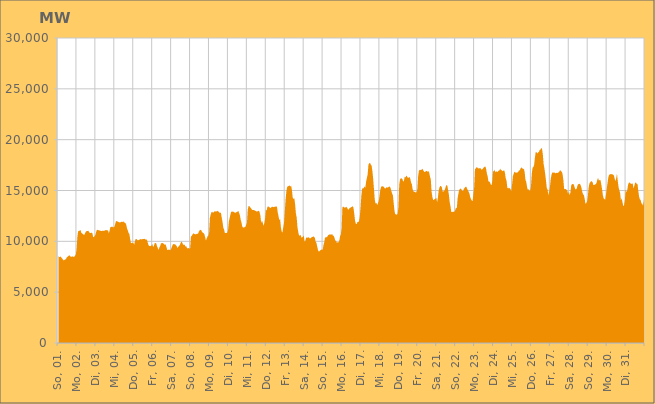
| Category | Series 0 |
|---|---|
|  So, 01.  | 8558.485 |
|  So, 01.  | 8463.427 |
|  So, 01.  | 8463.648 |
|  So, 01.  | 8516.056 |
|  So, 01.  | 8367.781 |
|  So, 01.  | 8287.862 |
|  So, 01.  | 8181.562 |
|  So, 01.  | 8106.669 |
|  So, 01.  | 8195.703 |
|  So, 01.  | 8206.647 |
|  So, 01.  | 8316.889 |
|  So, 01.  | 8466.153 |
|  So, 01.  | 8501.322 |
|  So, 01.  | 8574.746 |
|  So, 01.  | 8637.57 |
|  So, 01.  | 8530.301 |
|  So, 01.  | 8480.965 |
|  Mo, 02.  | 8494.642 |
|  Mo, 02.  | 8526.363 |
|  Mo, 02.  | 8468.096 |
|  Mo, 02.  | 8495.179 |
|  Mo, 02.  | 8577.359 |
|  Mo, 02.  | 8684.504 |
|  Mo, 02.  | 9178.877 |
|  Mo, 02.  | 10389.224 |
|  Mo, 02.  | 11005.984 |
|  Mo, 02.  | 10993.198 |
|  Mo, 02.  | 11062.244 |
|  Mo, 02.  | 11123.003 |
|  Mo, 02.  | 10846.319 |
|  Mo, 02.  | 10768.411 |
|  Mo, 02.  | 10740.352 |
|  Mo, 02.  | 10639.129 |
|  Mo, 02.  | 10639.675 |
|  Mo, 02.  | 10835.303 |
|  Mo, 02.  | 10963.51 |
|  Mo, 02.  | 11008.435 |
|  Mo, 02.  | 11008.462 |
|  Mo, 02.  | 11036.606 |
|  Mo, 02.  | 10899.569 |
|  Mo, 02.  | 10822.927 |
|  Di, 03.  | 10824.484 |
|  Di, 03.  | 10857.351 |
|  Di, 03.  | 10806.544 |
|  Di, 03.  | 10448.628 |
|  Di, 03.  | 10409.631 |
|  Di, 03.  | 10529.491 |
|  Di, 03.  | 10647.502 |
|  Di, 03.  | 10975.183 |
|  Di, 03.  | 11144.995 |
|  Di, 03.  | 11108.64 |
|  Di, 03.  | 11091.864 |
|  Di, 03.  | 11074.186 |
|  Di, 03.  | 11055.197 |
|  Di, 03.  | 11016.311 |
|  Di, 03.  | 11019.715 |
|  Di, 03.  | 11052.879 |
|  Di, 03.  | 11021.801 |
|  Di, 03.  | 11045.961 |
|  Di, 03.  | 11063.802 |
|  Di, 03.  | 11114.223 |
|  Di, 03.  | 11091.403 |
|  Di, 03.  | 11089.768 |
|  Di, 03.  | 11040.786 |
|  Di, 03.  | 10799.435 |
|  Mi, 04.  | 11082.207 |
|  Mi, 04.  | 11424.757 |
|  Mi, 04.  | 11401.531 |
|  Mi, 04.  | 11486.709 |
|  Mi, 04.  | 11385.831 |
|  Mi, 04.  | 11374.71 |
|  Mi, 04.  | 11441.291 |
|  Mi, 04.  | 11708.451 |
|  Mi, 04.  | 11986.274 |
|  Mi, 04.  | 11993.034 |
|  Mi, 04.  | 11945.38 |
|  Mi, 04.  | 11912.765 |
|  Mi, 04.  | 11862.687 |
|  Mi, 04.  | 11878.195 |
|  Mi, 04.  | 11866.324 |
|  Mi, 04.  | 11927.433 |
|  Mi, 04.  | 11922.636 |
|  Mi, 04.  | 11876.919 |
|  Mi, 04.  | 11975.498 |
|  Mi, 04.  | 11815.579 |
|  Mi, 04.  | 11810.878 |
|  Mi, 04.  | 11625.348 |
|  Mi, 04.  | 11269.076 |
|  Mi, 04.  | 11059.613 |
|  Do, 05.  | 10826.592 |
|  Do, 05.  | 10690.116 |
|  Do, 05.  | 10189.594 |
|  Do, 05.  | 9816.135 |
|  Do, 05.  | 9852.142 |
|  Do, 05.  | 9844.398 |
|  Do, 05.  | 9861.335 |
|  Do, 05.  | 9669.859 |
|  Do, 05.  | 10001.116 |
|  Do, 05.  | 10243.876 |
|  Do, 05.  | 10226.969 |
|  Do, 05.  | 10128.296 |
|  Do, 05.  | 10093.512 |
|  Do, 05.  | 10139.297 |
|  Do, 05.  | 10170.797 |
|  Do, 05.  | 10224.03 |
|  Do, 05.  | 10191.314 |
|  Do, 05.  | 10194.498 |
|  Do, 05.  | 10227.001 |
|  Do, 05.  | 10239.544 |
|  Do, 05.  | 10243.935 |
|  Do, 05.  | 10231.862 |
|  Do, 05.  | 10129.621 |
|  Do, 05.  | 10203.822 |
|  Fr, 06.  | 9944.311 |
|  Fr, 06.  | 9661.864 |
|  Fr, 06.  | 9543.676 |
|  Fr, 06.  | 9537.75 |
|  Fr, 06.  | 9525.093 |
|  Fr, 06.  | 9596.969 |
|  Fr, 06.  | 9751.885 |
|  Fr, 06.  | 9452.042 |
|  Fr, 06.  | 9558.455 |
|  Fr, 06.  | 9812.745 |
|  Fr, 06.  | 9846.633 |
|  Fr, 06.  | 9795.23 |
|  Fr, 06.  | 9527.483 |
|  Fr, 06.  | 9338.401 |
|  Fr, 06.  | 9153.357 |
|  Fr, 06.  | 9401.279 |
|  Fr, 06.  | 9540.262 |
|  Fr, 06.  | 9783.515 |
|  Fr, 06.  | 9845.007 |
|  Fr, 06.  | 9828.008 |
|  Fr, 06.  | 9800.28 |
|  Fr, 06.  | 9693.679 |
|  Fr, 06.  | 9678.669 |
|  Fr, 06.  | 9679.835 |
|  Sa, 07.  | 9404.528 |
|  Sa, 07.  | 9159.087 |
|  Sa, 07.  | 9143.373 |
|  Sa, 07.  | 9207.661 |
|  Sa, 07.  | 9143.102 |
|  Sa, 07.  | 9124.001 |
|  Sa, 07.  | 9277.096 |
|  Sa, 07.  | 9493.959 |
|  Sa, 07.  | 9685.619 |
|  Sa, 07.  | 9726.273 |
|  Sa, 07.  | 9723.475 |
|  Sa, 07.  | 9719.21 |
|  Sa, 07.  | 9603.77 |
|  Sa, 07.  | 9523.706 |
|  Sa, 07.  | 9335.163 |
|  Sa, 07.  | 9464.308 |
|  Sa, 07.  | 9563.708 |
|  Sa, 07.  | 9641.676 |
|  Sa, 07.  | 9861.39 |
|  Sa, 07.  | 9981.265 |
|  Sa, 07.  | 9876.643 |
|  Sa, 07.  | 9677.791 |
|  Sa, 07.  | 9663.735 |
|  Sa, 07.  | 9657.794 |
|  So, 08.  | 9483.399 |
|  So, 08.  | 9527.061 |
|  So, 08.  | 9332.032 |
|  So, 08.  | 9309.602 |
|  So, 08.  | 9340.621 |
|  So, 08.  | 9268.791 |
|  So, 08.  | 9348.877 |
|  So, 08.  | 10478.278 |
|  So, 08.  | 10521.249 |
|  So, 08.  | 10668.12 |
|  So, 08.  | 10787.464 |
|  So, 08.  | 10745.925 |
|  So, 08.  | 10704.921 |
|  So, 08.  | 10689.301 |
|  So, 08.  | 10716.697 |
|  So, 08.  | 10750.348 |
|  So, 08.  | 10759.945 |
|  So, 08.  | 10953.876 |
|  So, 08.  | 11080.504 |
|  So, 08.  | 11134.207 |
|  So, 08.  | 11102.732 |
|  So, 08.  | 10924.91 |
|  So, 08.  | 10859.25 |
|  So, 08.  | 10796.377 |
|  Mo, 09.  | 10700.194 |
|  Mo, 09.  | 10413.05 |
|  Mo, 09.  | 10076.03 |
|  Mo, 09.  | 10293.945 |
|  Mo, 09.  | 10477.742 |
|  Mo, 09.  | 10551.573 |
|  Mo, 09.  | 10811.08 |
|  Mo, 09.  | 12304.063 |
|  Mo, 09.  | 12618.346 |
|  Mo, 09.  | 12863.199 |
|  Mo, 09.  | 12911.407 |
|  Mo, 09.  | 12799.973 |
|  Mo, 09.  | 12867.031 |
|  Mo, 09.  | 12970.238 |
|  Mo, 09.  | 12946.949 |
|  Mo, 09.  | 12905.065 |
|  Mo, 09.  | 13008.011 |
|  Mo, 09.  | 12973.395 |
|  Mo, 09.  | 12917.831 |
|  Mo, 09.  | 12828.519 |
|  Mo, 09.  | 12807.799 |
|  Mo, 09.  | 12799.592 |
|  Mo, 09.  | 12332.727 |
|  Mo, 09.  | 11922.442 |
|  Di, 10.  | 11345.169 |
|  Di, 10.  | 11160.351 |
|  Di, 10.  | 10812.409 |
|  Di, 10.  | 10807.373 |
|  Di, 10.  | 10817.538 |
|  Di, 10.  | 10859.963 |
|  Di, 10.  | 11068.692 |
|  Di, 10.  | 11926.194 |
|  Di, 10.  | 12282.882 |
|  Di, 10.  | 12624.077 |
|  Di, 10.  | 12929.045 |
|  Di, 10.  | 12897.987 |
|  Di, 10.  | 12936.863 |
|  Di, 10.  | 12901.689 |
|  Di, 10.  | 12861.522 |
|  Di, 10.  | 12776.501 |
|  Di, 10.  | 12850.777 |
|  Di, 10.  | 12868.846 |
|  Di, 10.  | 12921.628 |
|  Di, 10.  | 13005.559 |
|  Di, 10.  | 12791.645 |
|  Di, 10.  | 12585.081 |
|  Di, 10.  | 12137.081 |
|  Di, 10.  | 11864.845 |
|  Mi, 11.  | 11470.816 |
|  Mi, 11.  | 11347.113 |
|  Mi, 11.  | 11355.34 |
|  Mi, 11.  | 11388.487 |
|  Mi, 11.  | 11427.275 |
|  Mi, 11.  | 11616.212 |
|  Mi, 11.  | 11815.781 |
|  Mi, 11.  | 13119.161 |
|  Mi, 11.  | 13467.488 |
|  Mi, 11.  | 13485.414 |
|  Mi, 11.  | 13345.712 |
|  Mi, 11.  | 13279.301 |
|  Mi, 11.  | 13137.62 |
|  Mi, 11.  | 13078.512 |
|  Mi, 11.  | 13075.701 |
|  Mi, 11.  | 13095.193 |
|  Mi, 11.  | 13017.524 |
|  Mi, 11.  | 12992.682 |
|  Mi, 11.  | 12943.487 |
|  Mi, 11.  | 12928.915 |
|  Mi, 11.  | 12982.462 |
|  Mi, 11.  | 13005.798 |
|  Mi, 11.  | 12867.894 |
|  Mi, 11.  | 12539.017 |
|  Do, 12.  | 11828.774 |
|  Do, 12.  | 12044.995 |
|  Do, 12.  | 11823.108 |
|  Do, 12.  | 11530.49 |
|  Do, 12.  | 11792.007 |
|  Do, 12.  | 12258.957 |
|  Do, 12.  | 13106.908 |
|  Do, 12.  | 13034.007 |
|  Do, 12.  | 13405.189 |
|  Do, 12.  | 13426.35 |
|  Do, 12.  | 13385.647 |
|  Do, 12.  | 13319.29 |
|  Do, 12.  | 13268.204 |
|  Do, 12.  | 13367.404 |
|  Do, 12.  | 13421.888 |
|  Do, 12.  | 13358.021 |
|  Do, 12.  | 13381.582 |
|  Do, 12.  | 13398.329 |
|  Do, 12.  | 13420.901 |
|  Do, 12.  | 13390.282 |
|  Do, 12.  | 13456.332 |
|  Do, 12.  | 12841.324 |
|  Do, 12.  | 12466.766 |
|  Do, 12.  | 12087.925 |
|  Fr, 13.  | 12191.105 |
|  Fr, 13.  | 11392.436 |
|  Fr, 13.  | 10962.628 |
|  Fr, 13.  | 10869.113 |
|  Fr, 13.  | 11372.275 |
|  Fr, 13.  | 11825.968 |
|  Fr, 13.  | 12968.546 |
|  Fr, 13.  | 14153.793 |
|  Fr, 13.  | 14939.045 |
|  Fr, 13.  | 15365.443 |
|  Fr, 13.  | 15425.457 |
|  Fr, 13.  | 15441.568 |
|  Fr, 13.  | 15506.173 |
|  Fr, 13.  | 15388.698 |
|  Fr, 13.  | 15471.452 |
|  Fr, 13.  | 15035.644 |
|  Fr, 13.  | 14298.805 |
|  Fr, 13.  | 14159.858 |
|  Fr, 13.  | 14256.784 |
|  Fr, 13.  | 13667.894 |
|  Fr, 13.  | 12763.638 |
|  Fr, 13.  | 12350.296 |
|  Fr, 13.  | 11400.613 |
|  Fr, 13.  | 10908.807 |
|  Sa, 14.  | 10573.774 |
|  Sa, 14.  | 10577.969 |
|  Sa, 14.  | 10622.493 |
|  Sa, 14.  | 10380.474 |
|  Sa, 14.  | 10392.032 |
|  Sa, 14.  | 10435.466 |
|  Sa, 14.  | 10591.975 |
|  Sa, 14.  | 9959.643 |
|  Sa, 14.  | 10073.888 |
|  Sa, 14.  | 10350.229 |
|  Sa, 14.  | 10377.303 |
|  Sa, 14.  | 10353.391 |
|  Sa, 14.  | 10407.621 |
|  Sa, 14.  | 10346.695 |
|  Sa, 14.  | 10270.911 |
|  Sa, 14.  | 10338.025 |
|  Sa, 14.  | 10413.6 |
|  Sa, 14.  | 10432.243 |
|  Sa, 14.  | 10485.952 |
|  Sa, 14.  | 10446.689 |
|  Sa, 14.  | 10364.079 |
|  Sa, 14.  | 9960.382 |
|  Sa, 14.  | 9859.638 |
|  Sa, 14.  | 9503.071 |
|  So, 15.  | 9161.122 |
|  So, 15.  | 8986.55 |
|  So, 15.  | 9038.37 |
|  So, 15.  | 9122.856 |
|  So, 15.  | 9164.631 |
|  So, 15.  | 9199 |
|  So, 15.  | 9161.2 |
|  So, 15.  | 9646.656 |
|  So, 15.  | 9923.921 |
|  So, 15.  | 10416.112 |
|  So, 15.  | 10351.492 |
|  So, 15.  | 10417.857 |
|  So, 15.  | 10473.7 |
|  So, 15.  | 10605.095 |
|  So, 15.  | 10659.811 |
|  So, 15.  | 10682.937 |
|  So, 15.  | 10666.915 |
|  So, 15.  | 10658.722 |
|  So, 15.  | 10721.143 |
|  So, 15.  | 10541.394 |
|  So, 15.  | 10544.363 |
|  So, 15.  | 10322.303 |
|  So, 15.  | 10079.996 |
|  So, 15.  | 10024.019 |
|  Mo, 16.  | 9866.952 |
|  Mo, 16.  | 9909.354 |
|  Mo, 16.  | 9894.799 |
|  Mo, 16.  | 10062.522 |
|  Mo, 16.  | 10510.949 |
|  Mo, 16.  | 10678.332 |
|  Mo, 16.  | 11263.558 |
|  Mo, 16.  | 13351.237 |
|  Mo, 16.  | 13431.314 |
|  Mo, 16.  | 13332.358 |
|  Mo, 16.  | 13325.278 |
|  Mo, 16.  | 13338.395 |
|  Mo, 16.  | 13398.773 |
|  Mo, 16.  | 13289.098 |
|  Mo, 16.  | 13131.097 |
|  Mo, 16.  | 13121.292 |
|  Mo, 16.  | 13266.853 |
|  Mo, 16.  | 13298.244 |
|  Mo, 16.  | 13358.244 |
|  Mo, 16.  | 13398.017 |
|  Mo, 16.  | 13450.609 |
|  Mo, 16.  | 13306.253 |
|  Mo, 16.  | 12705.058 |
|  Mo, 16.  | 12021.994 |
|  Di, 17.  | 11722.152 |
|  Di, 17.  | 11701.014 |
|  Di, 17.  | 11888.367 |
|  Di, 17.  | 11906.355 |
|  Di, 17.  | 11971.691 |
|  Di, 17.  | 12439.455 |
|  Di, 17.  | 13304.609 |
|  Di, 17.  | 14501.256 |
|  Di, 17.  | 15140.924 |
|  Di, 17.  | 15282.612 |
|  Di, 17.  | 15190.646 |
|  Di, 17.  | 15422.245 |
|  Di, 17.  | 15256.807 |
|  Di, 17.  | 15866.616 |
|  Di, 17.  | 16238.914 |
|  Di, 17.  | 16590.16 |
|  Di, 17.  | 17555.987 |
|  Di, 17.  | 17673.984 |
|  Di, 17.  | 17714.188 |
|  Di, 17.  | 17541.297 |
|  Di, 17.  | 17435.073 |
|  Di, 17.  | 16889.819 |
|  Di, 17.  | 16132.646 |
|  Di, 17.  | 15102.939 |
|  Mi, 18.  | 14080.188 |
|  Mi, 18.  | 13722.95 |
|  Mi, 18.  | 13784.903 |
|  Mi, 18.  | 13581.704 |
|  Mi, 18.  | 13742.818 |
|  Mi, 18.  | 13960.436 |
|  Mi, 18.  | 14446.329 |
|  Mi, 18.  | 15057.288 |
|  Mi, 18.  | 15336.216 |
|  Mi, 18.  | 15432.088 |
|  Mi, 18.  | 15408.389 |
|  Mi, 18.  | 15394.837 |
|  Mi, 18.  | 15298.155 |
|  Mi, 18.  | 15181.911 |
|  Mi, 18.  | 15240.882 |
|  Mi, 18.  | 15315.312 |
|  Mi, 18.  | 15293.253 |
|  Mi, 18.  | 15313.022 |
|  Mi, 18.  | 15389.826 |
|  Mi, 18.  | 15376.863 |
|  Mi, 18.  | 15240.676 |
|  Mi, 18.  | 14954.831 |
|  Mi, 18.  | 14694.453 |
|  Mi, 18.  | 14518.529 |
|  Do, 19.  | 13741.503 |
|  Do, 19.  | 12979.142 |
|  Do, 19.  | 12649.767 |
|  Do, 19.  | 12669.686 |
|  Do, 19.  | 12607.635 |
|  Do, 19.  | 12736.234 |
|  Do, 19.  | 13362.684 |
|  Do, 19.  | 15567.245 |
|  Do, 19.  | 16085.642 |
|  Do, 19.  | 16210.741 |
|  Do, 19.  | 16193.44 |
|  Do, 19.  | 16118.029 |
|  Do, 19.  | 15864.408 |
|  Do, 19.  | 15966.94 |
|  Do, 19.  | 16370.723 |
|  Do, 19.  | 16286.974 |
|  Do, 19.  | 16484.57 |
|  Do, 19.  | 16350.588 |
|  Do, 19.  | 16244.976 |
|  Do, 19.  | 16251.2 |
|  Do, 19.  | 16335.904 |
|  Do, 19.  | 16150.876 |
|  Do, 19.  | 15787.085 |
|  Do, 19.  | 15625.387 |
|  Fr, 20.  | 15119.046 |
|  Fr, 20.  | 14925.191 |
|  Fr, 20.  | 14829.879 |
|  Fr, 20.  | 14906.337 |
|  Fr, 20.  | 14782.152 |
|  Fr, 20.  | 14842.249 |
|  Fr, 20.  | 15196.888 |
|  Fr, 20.  | 16450.724 |
|  Fr, 20.  | 16934.643 |
|  Fr, 20.  | 17040.742 |
|  Fr, 20.  | 17015.843 |
|  Fr, 20.  | 17005.473 |
|  Fr, 20.  | 17141.676 |
|  Fr, 20.  | 17052.28 |
|  Fr, 20.  | 16908.833 |
|  Fr, 20.  | 16805.585 |
|  Fr, 20.  | 16855.299 |
|  Fr, 20.  | 16909.406 |
|  Fr, 20.  | 16928.675 |
|  Fr, 20.  | 16844.803 |
|  Fr, 20.  | 16905.443 |
|  Fr, 20.  | 16766.725 |
|  Fr, 20.  | 16349.908 |
|  Fr, 20.  | 16106.011 |
|  Sa, 21.  | 14892.748 |
|  Sa, 21.  | 14358.911 |
|  Sa, 21.  | 14058.852 |
|  Sa, 21.  | 14106.576 |
|  Sa, 21.  | 14157.443 |
|  Sa, 21.  | 14195.008 |
|  Sa, 21.  | 14281.23 |
|  Sa, 21.  | 13857.799 |
|  Sa, 21.  | 14288.992 |
|  Sa, 21.  | 14994.29 |
|  Sa, 21.  | 15299.693 |
|  Sa, 21.  | 15431.226 |
|  Sa, 21.  | 15441.75 |
|  Sa, 21.  | 15318.702 |
|  Sa, 21.  | 14903.399 |
|  Sa, 21.  | 14903.39 |
|  Sa, 21.  | 14943.454 |
|  Sa, 21.  | 15118.058 |
|  Sa, 21.  | 15393.686 |
|  Sa, 21.  | 15551.479 |
|  Sa, 21.  | 15459.208 |
|  Sa, 21.  | 15032.254 |
|  Sa, 21.  | 14536.689 |
|  Sa, 21.  | 13830.338 |
|  So, 22.  | 13423.87 |
|  So, 22.  | 12897.834 |
|  So, 22.  | 12877.514 |
|  So, 22.  | 12916.633 |
|  So, 22.  | 12897.525 |
|  So, 22.  | 12903.895 |
|  So, 22.  | 13071.426 |
|  So, 22.  | 13330.337 |
|  So, 22.  | 13235.422 |
|  So, 22.  | 14241.581 |
|  So, 22.  | 14678.806 |
|  So, 22.  | 15082.644 |
|  So, 22.  | 15125.502 |
|  So, 22.  | 15215.173 |
|  So, 22.  | 15088.007 |
|  So, 22.  | 14951.751 |
|  So, 22.  | 14955.655 |
|  So, 22.  | 15178.179 |
|  So, 22.  | 15267.514 |
|  So, 22.  | 15357.797 |
|  So, 22.  | 15362.299 |
|  So, 22.  | 15174.798 |
|  So, 22.  | 15026.604 |
|  So, 22.  | 14879.216 |
|  Mo, 23.  | 14678.239 |
|  Mo, 23.  | 14344.854 |
|  Mo, 23.  | 14138.824 |
|  Mo, 23.  | 14024.843 |
|  Mo, 23.  | 13960.976 |
|  Mo, 23.  | 14639.141 |
|  Mo, 23.  | 15351.417 |
|  Mo, 23.  | 17102.197 |
|  Mo, 23.  | 17183.419 |
|  Mo, 23.  | 17274.85 |
|  Mo, 23.  | 17280.021 |
|  Mo, 23.  | 17128.881 |
|  Mo, 23.  | 17217.703 |
|  Mo, 23.  | 17170.656 |
|  Mo, 23.  | 17200.392 |
|  Mo, 23.  | 17056.627 |
|  Mo, 23.  | 17077.107 |
|  Mo, 23.  | 17132.956 |
|  Mo, 23.  | 17265.015 |
|  Mo, 23.  | 17320.004 |
|  Mo, 23.  | 17380.718 |
|  Mo, 23.  | 17183.964 |
|  Mo, 23.  | 16694.139 |
|  Mo, 23.  | 16424.651 |
|  Di, 24.  | 15908.972 |
|  Di, 24.  | 15871.837 |
|  Di, 24.  | 15803.604 |
|  Di, 24.  | 15590.677 |
|  Di, 24.  | 15522.019 |
|  Di, 24.  | 15912.964 |
|  Di, 24.  | 16945.453 |
|  Di, 24.  | 16848.448 |
|  Di, 24.  | 17060.076 |
|  Di, 24.  | 16785.813 |
|  Di, 24.  | 16875.25 |
|  Di, 24.  | 16853.33 |
|  Di, 24.  | 16850.944 |
|  Di, 24.  | 16954.16 |
|  Di, 24.  | 16971.308 |
|  Di, 24.  | 17163.382 |
|  Di, 24.  | 16978.341 |
|  Di, 24.  | 17005.316 |
|  Di, 24.  | 16884.197 |
|  Di, 24.  | 16949.339 |
|  Di, 24.  | 16997.125 |
|  Di, 24.  | 16730.647 |
|  Di, 24.  | 16181.245 |
|  Di, 24.  | 15980.512 |
|  Mi, 25.  | 15280.846 |
|  Mi, 25.  | 15204.394 |
|  Mi, 25.  | 15285.689 |
|  Mi, 25.  | 15204.541 |
|  Mi, 25.  | 15148.7 |
|  Mi, 25.  | 14893.994 |
|  Mi, 25.  | 15573.088 |
|  Mi, 25.  | 16389.846 |
|  Mi, 25.  | 16628.018 |
|  Mi, 25.  | 16847.476 |
|  Mi, 25.  | 16781.693 |
|  Mi, 25.  | 16744.099 |
|  Mi, 25.  | 16762.879 |
|  Mi, 25.  | 16774.392 |
|  Mi, 25.  | 16875.407 |
|  Mi, 25.  | 16962.602 |
|  Mi, 25.  | 17018.071 |
|  Mi, 25.  | 17204.027 |
|  Mi, 25.  | 17281.043 |
|  Mi, 25.  | 17197.517 |
|  Mi, 25.  | 17091.867 |
|  Mi, 25.  | 17140.393 |
|  Mi, 25.  | 16772.588 |
|  Mi, 25.  | 16050.042 |
|  Do, 26.  | 15847.248 |
|  Do, 26.  | 15349.32 |
|  Do, 26.  | 15066.163 |
|  Do, 26.  | 15132.824 |
|  Do, 26.  | 14971.087 |
|  Do, 26.  | 15002.221 |
|  Do, 26.  | 15430.032 |
|  Do, 26.  | 16613.689 |
|  Do, 26.  | 17228.972 |
|  Do, 26.  | 17308.128 |
|  Do, 26.  | 17540.082 |
|  Do, 26.  | 18245.061 |
|  Do, 26.  | 18780.623 |
|  Do, 26.  | 18769.372 |
|  Do, 26.  | 18626.423 |
|  Do, 26.  | 18752.272 |
|  Do, 26.  | 18781.648 |
|  Do, 26.  | 18990.148 |
|  Do, 26.  | 19007.458 |
|  Do, 26.  | 19190.837 |
|  Do, 26.  | 19099.153 |
|  Do, 26.  | 18554.616 |
|  Do, 26.  | 17610.316 |
|  Do, 26.  | 17179.354 |
|  Fr, 27.  | 16626.419 |
|  Fr, 27.  | 15963.446 |
|  Fr, 27.  | 15252.104 |
|  Fr, 27.  | 15105.467 |
|  Fr, 27.  | 14527.124 |
|  Fr, 27.  | 14889.15 |
|  Fr, 27.  | 15353.822 |
|  Fr, 27.  | 16110.386 |
|  Fr, 27.  | 16542.12 |
|  Fr, 27.  | 16765.334 |
|  Fr, 27.  | 16772.917 |
|  Fr, 27.  | 16747.7 |
|  Fr, 27.  | 16773.71 |
|  Fr, 27.  | 16683.579 |
|  Fr, 27.  | 16720.187 |
|  Fr, 27.  | 16756.969 |
|  Fr, 27.  | 16716.703 |
|  Fr, 27.  | 16803.86 |
|  Fr, 27.  | 16878.522 |
|  Fr, 27.  | 17005.275 |
|  Fr, 27.  | 16914.849 |
|  Fr, 27.  | 16842.754 |
|  Fr, 27.  | 16610.222 |
|  Fr, 27.  | 16062.122 |
|  Sa, 28.  | 15196.05 |
|  Sa, 28.  | 15112.111 |
|  Sa, 28.  | 15162.155 |
|  Sa, 28.  | 15072.755 |
|  Sa, 28.  | 14997.233 |
|  Sa, 28.  | 14649.115 |
|  Sa, 28.  | 14928.011 |
|  Sa, 28.  | 14539.834 |
|  Sa, 28.  | 14812.907 |
|  Sa, 28.  | 15502.736 |
|  Sa, 28.  | 15624.177 |
|  Sa, 28.  | 15638.553 |
|  Sa, 28.  | 15618.798 |
|  Sa, 28.  | 15397.511 |
|  Sa, 28.  | 15159.046 |
|  Sa, 28.  | 15093.08 |
|  Sa, 28.  | 15201.482 |
|  Sa, 28.  | 15505.794 |
|  Sa, 28.  | 15621.161 |
|  Sa, 28.  | 15648.327 |
|  Sa, 28.  | 15654.828 |
|  Sa, 28.  | 15492.839 |
|  Sa, 28.  | 15269.012 |
|  Sa, 28.  | 14847.456 |
|  So, 29.  | 14638.331 |
|  So, 29.  | 14532.725 |
|  So, 29.  | 14218.605 |
|  So, 29.  | 13700.938 |
|  So, 29.  | 13754.542 |
|  So, 29.  | 13898.442 |
|  So, 29.  | 14379.357 |
|  So, 29.  | 15247.081 |
|  So, 29.  | 15658.538 |
|  So, 29.  | 15802.896 |
|  So, 29.  | 15900.571 |
|  So, 29.  | 15909.846 |
|  So, 29.  | 15823.97 |
|  So, 29.  | 15544.856 |
|  So, 29.  | 15532.069 |
|  So, 29.  | 15589.153 |
|  So, 29.  | 15618.645 |
|  So, 29.  | 15739.531 |
|  So, 29.  | 16028.171 |
|  So, 29.  | 16243.489 |
|  So, 29.  | 15985.986 |
|  So, 29.  | 16020.014 |
|  So, 29.  | 16027.261 |
|  So, 29.  | 15635.876 |
|  Mo, 30.  | 15182.93 |
|  Mo, 30.  | 14573.499 |
|  Mo, 30.  | 14240.113 |
|  Mo, 30.  | 14155.709 |
|  Mo, 30.  | 14084.69 |
|  Mo, 30.  | 14572.381 |
|  Mo, 30.  | 15192.693 |
|  Mo, 30.  | 15735.08 |
|  Mo, 30.  | 16284.861 |
|  Mo, 30.  | 16562.342 |
|  Mo, 30.  | 16560.003 |
|  Mo, 30.  | 16637.441 |
|  Mo, 30.  | 16602.395 |
|  Mo, 30.  | 16617.066 |
|  Mo, 30.  | 16542.936 |
|  Mo, 30.  | 16492.782 |
|  Mo, 30.  | 16171 |
|  Mo, 30.  | 15921.493 |
|  Mo, 30.  | 16206.663 |
|  Mo, 30.  | 16650.599 |
|  Mo, 30.  | 15904.277 |
|  Mo, 30.  | 15319.877 |
|  Mo, 30.  | 15015.404 |
|  Mo, 30.  | 14733.524 |
|  Di, 31.  | 14001.664 |
|  Di, 31.  | 14232.758 |
|  Di, 31.  | 13835.277 |
|  Di, 31.  | 13452.625 |
|  Di, 31.  | 13565.08 |
|  Di, 31.  | 14097.252 |
|  Di, 31.  | 15108.662 |
|  Di, 31.  | 14820.879 |
|  Di, 31.  | 15040.864 |
|  Di, 31.  | 15536.473 |
|  Di, 31.  | 15764.661 |
|  Di, 31.  | 15780.469 |
|  Di, 31.  | 15696.839 |
|  Di, 31.  | 15630.936 |
|  Di, 31.  | 15696.685 |
|  Di, 31.  | 15664.125 |
|  Di, 31.  | 15186.814 |
|  Di, 31.  | 15475.424 |
|  Di, 31.  | 15748.237 |
|  Di, 31.  | 15801.498 |
|  Di, 31.  | 15650.498 |
|  Di, 31.  | 15642.277 |
|  Di, 31.  | 14965.145 |
|  Di, 31.  | 14397.884 |
|  Mi, 01.  | 14146.222 |
|  Mi, 01.  | 14064.946 |
|  Mi, 01.  | 13731.022 |
|  Mi, 01.  | 13678.388 |
|  Mi, 01.  | 13492.055 |
|  Mi, 01.  | 13984.381 |